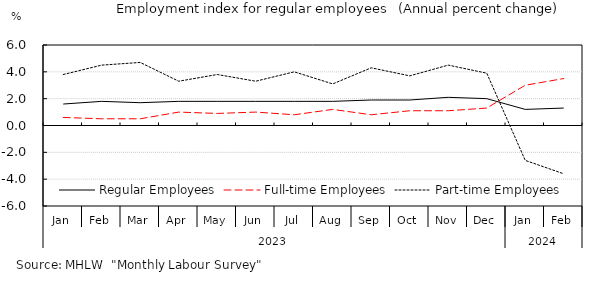
| Category | Regular Employees | Full-time Employees | Part-time Employees |
|---|---|---|---|
| 0 | 1.6 | 0.6 | 3.8 |
| 1 | 1.8 | 0.5 | 4.5 |
| 2 | 1.7 | 0.5 | 4.7 |
| 3 | 1.8 | 1 | 3.3 |
| 4 | 1.8 | 0.9 | 3.8 |
| 5 | 1.8 | 1 | 3.3 |
| 6 | 1.8 | 0.8 | 4 |
| 7 | 1.8 | 1.2 | 3.1 |
| 8 | 1.9 | 0.8 | 4.3 |
| 9 | 1.9 | 1.1 | 3.7 |
| 10 | 2.1 | 1.1 | 4.5 |
| 11 | 2 | 1.3 | 3.9 |
| 12 | 1.2 | 3 | -2.6 |
| 13 | 1.3 | 3.5 | -3.6 |